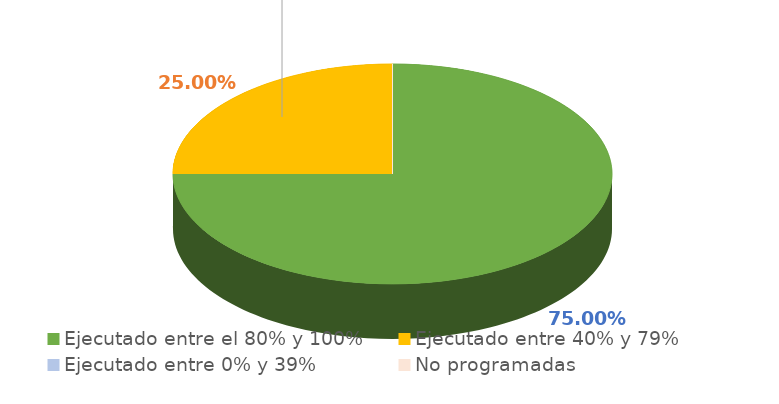
| Category | Series 0 |
|---|---|
| Ejecutado entre el 80% y 100% | 0.75 |
| Ejecutado entre 40% y 79% | 0.25 |
| Ejecutado entre 0% y 39% | 0 |
| No programadas | 0 |